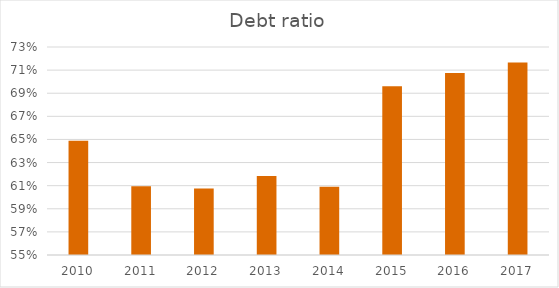
| Category | Debt ratio |
|---|---|
| 2010.0 | 0.649 |
| 2011.0 | 0.61 |
| 2012.0 | 0.608 |
| 2013.0 | 0.618 |
| 2014.0 | 0.609 |
| 2015.0 | 0.696 |
| 2016.0 | 0.707 |
| 2017.0 | 0.717 |